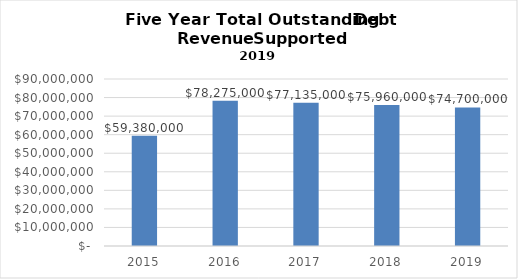
| Category | Series 0 |
|---|---|
| 2015.0 | 59380000 |
| 2016.0 | 78275000 |
| 2017.0 | 77135000 |
| 2018.0 | 75960000 |
| 2019.0 | 74700000 |